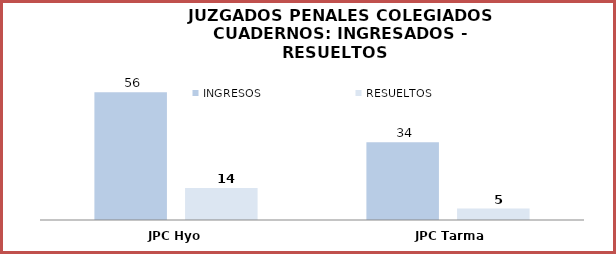
| Category | INGRESOS | RESUELTOS |
|---|---|---|
| JPC Hyo | 56 | 14 |
| JPC Tarma | 34 | 5 |